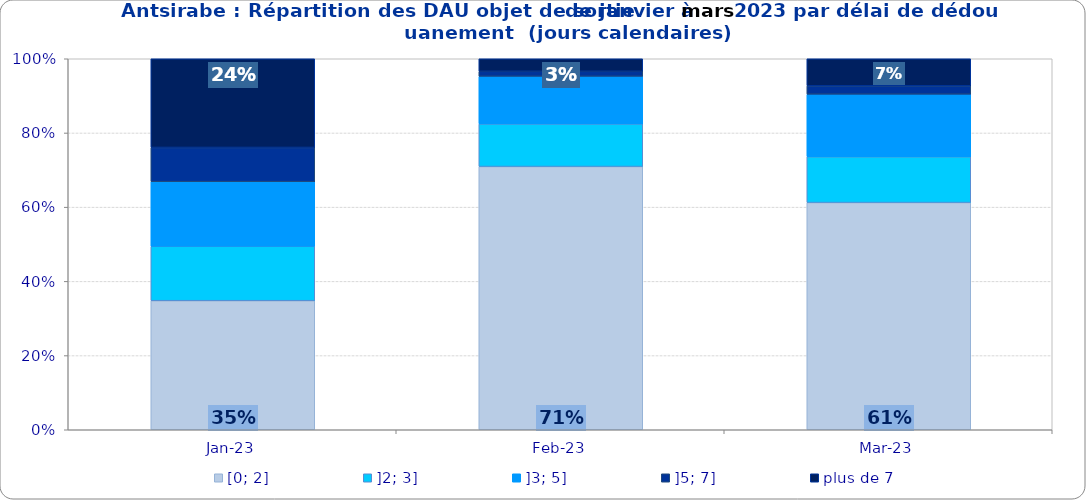
| Category | [0; 2] | ]2; 3] | ]3; 5] | ]5; 7] | plus de 7 |
|---|---|---|---|---|---|
| 2023-01-01 | 0.348 | 0.147 | 0.174 | 0.092 | 0.239 |
| 2023-02-01 | 0.709 | 0.115 | 0.128 | 0.014 | 0.034 |
| 2023-03-01 | 0.612 | 0.124 | 0.169 | 0.022 | 0.073 |